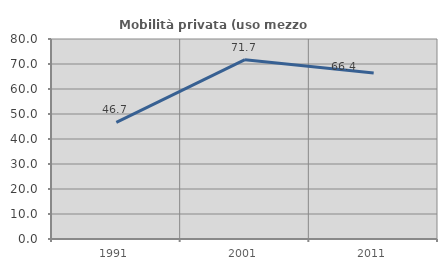
| Category | Mobilità privata (uso mezzo privato) |
|---|---|
| 1991.0 | 46.667 |
| 2001.0 | 71.739 |
| 2011.0 | 66.364 |